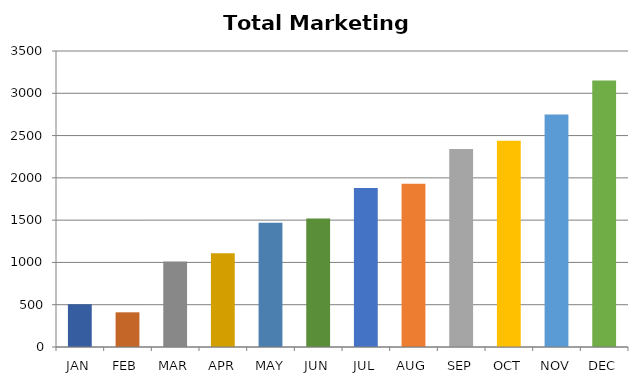
| Category | Series 0 |
|---|---|
| JAN | 505 |
| FEB | 410 |
| MAR | 1012 |
| APR | 1110 |
| MAY | 1470 |
| JUN | 1520 |
| JUL | 1880 |
| AUG | 1930 |
| SEP | 2340 |
| OCT | 2440 |
| NOV | 2750 |
| DEC | 3150 |